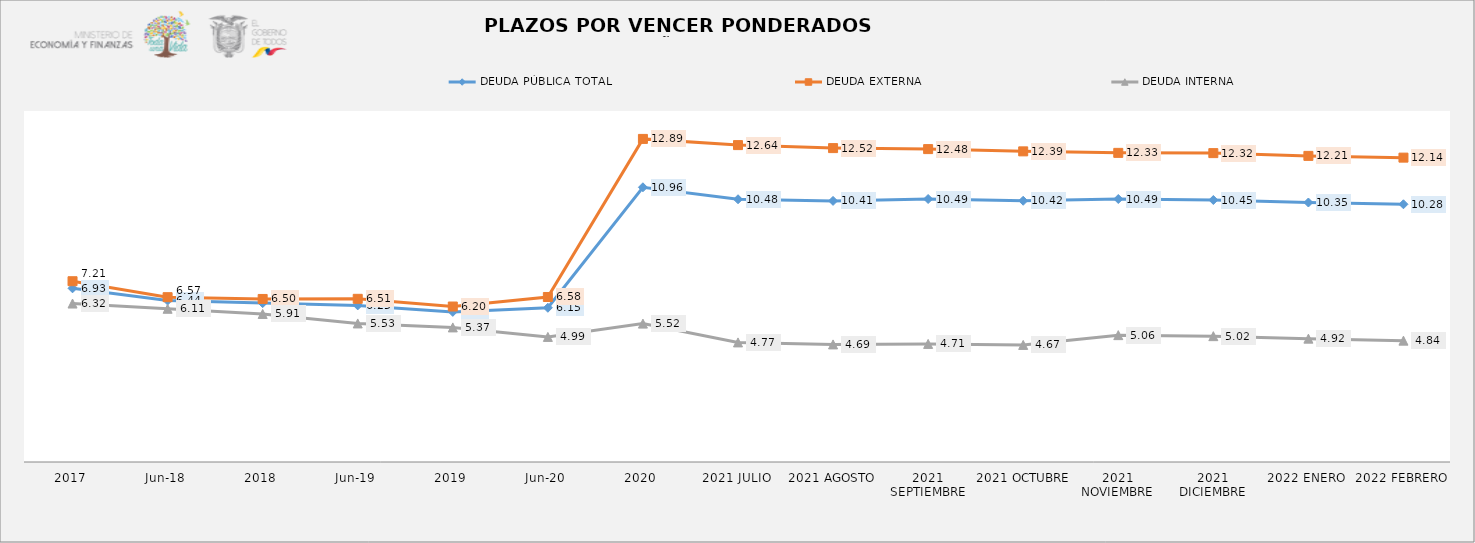
| Category | DEUDA PÚBLICA TOTAL | DEUDA EXTERNA  | DEUDA INTERNA |
|---|---|---|---|
| 2017 | 6.927 | 7.21 | 6.32 |
| jun-18 | 6.439 | 6.574 | 6.111 |
| 2018 | 6.337 | 6.503 | 5.906 |
| jun-19 | 6.246 | 6.509 | 5.526 |
| 2019 | 5.988 | 6.201 | 5.368 |
| jun-20 | 6.152 | 6.581 | 4.989 |
| 2020 | 10.957 | 12.887 | 5.519 |
| 2021 JULIO | 10.48 | 12.64 | 4.77 |
| 2021 AGOSTO | 10.414 | 12.52 | 4.69 |
| 2021 SEPTIEMBRE | 10.49 | 12.48 | 4.71 |
| 2021 OCTUBRE | 10.42 | 12.39 | 4.67 |
| 2021 NOVIEMBRE | 10.49 | 12.33 | 5.06 |
| 2021 DICIEMBRE | 10.45 | 12.32 | 5.02 |
| 2022 ENERO | 10.35 | 12.21 | 4.92 |
| 2022 FEBRERO | 10.28 | 12.14 | 4.84 |